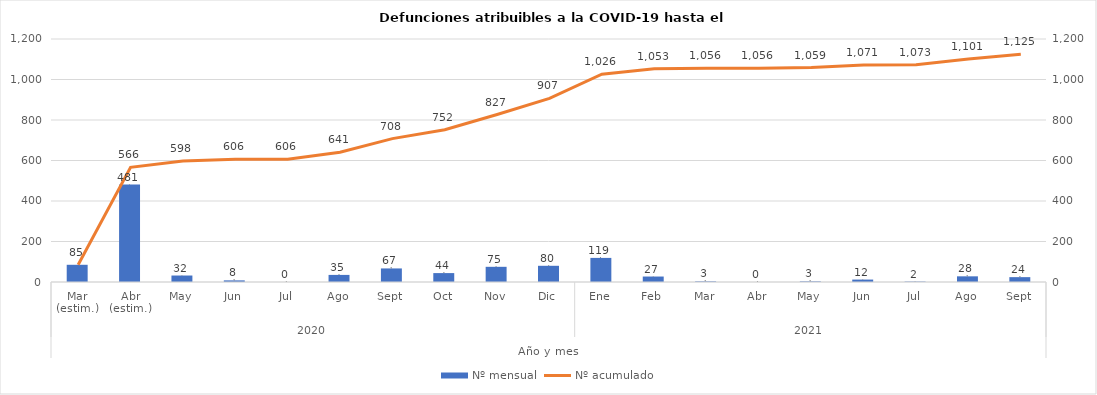
| Category | Nº mensual |
|---|---|
| 0 | 85 |
| 1 | 481 |
| 2 | 32 |
| 3 | 8 |
| 4 | 0 |
| 5 | 35 |
| 6 | 67 |
| 7 | 44 |
| 8 | 75 |
| 9 | 80 |
| 10 | 119 |
| 11 | 27 |
| 12 | 3 |
| 13 | 0 |
| 14 | 3 |
| 15 | 12 |
| 16 | 2 |
| 17 | 28 |
| 18 | 24 |